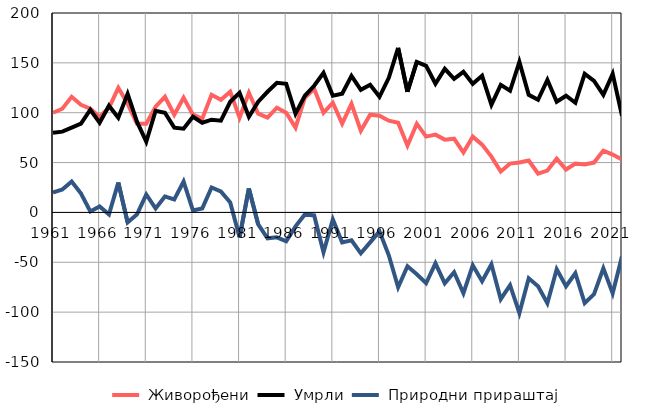
| Category |  Живорођени |  Умрли |  Природни прираштај |
|---|---|---|---|
| 1961.0 | 100 | 80 | 20 |
| 1962.0 | 104 | 81 | 23 |
| 1963.0 | 116 | 85 | 31 |
| 1964.0 | 108 | 89 | 19 |
| 1965.0 | 104 | 103 | 1 |
| 1966.0 | 96 | 90 | 6 |
| 1967.0 | 105 | 107 | -2 |
| 1968.0 | 125 | 95 | 30 |
| 1969.0 | 109 | 119 | -10 |
| 1970.0 | 89 | 91 | -2 |
| 1971.0 | 89 | 71 | 18 |
| 1972.0 | 106 | 102 | 4 |
| 1973.0 | 116 | 100 | 16 |
| 1974.0 | 98 | 85 | 13 |
| 1975.0 | 115 | 84 | 31 |
| 1976.0 | 98 | 96 | 2 |
| 1977.0 | 94 | 90 | 4 |
| 1978.0 | 118 | 93 | 25 |
| 1979.0 | 113 | 92 | 21 |
| 1980.0 | 121 | 111 | 10 |
| 1981.0 | 95 | 120 | -25 |
| 1982.0 | 120 | 96 | 24 |
| 1983.0 | 99 | 111 | -12 |
| 1984.0 | 95 | 121 | -26 |
| 1985.0 | 105 | 130 | -25 |
| 1986.0 | 100 | 129 | -29 |
| 1987.0 | 85 | 99 | -14 |
| 1988.0 | 115 | 117 | -2 |
| 1989.0 | 124 | 127 | -3 |
| 1990.0 | 100 | 140 | -40 |
| 1991.0 | 110 | 117 | -7 |
| 1992.0 | 89 | 119 | -30 |
| 1993.0 | 109 | 137 | -28 |
| 1994.0 | 82 | 123 | -41 |
| 1995.0 | 98 | 128 | -30 |
| 1996.0 | 97 | 116 | -19 |
| 1997.0 | 92 | 135 | -43 |
| 1998.0 | 90 | 165 | -75 |
| 1999.0 | 67 | 121 | -54 |
| 2000.0 | 89 | 151 | -62 |
| 2001.0 | 76 | 147 | -71 |
| 2002.0 | 78 | 129 | -51 |
| 2003.0 | 73 | 144 | -71 |
| 2004.0 | 74 | 134 | -60 |
| 2005.0 | 60 | 141 | -81 |
| 2006.0 | 76 | 129 | -53 |
| 2007.0 | 68 | 137 | -69 |
| 2008.0 | 56 | 108 | -52 |
| 2009.0 | 41 | 128 | -87 |
| 2010.0 | 49 | 122 | -73 |
| 2011.0 | 50 | 151 | -101 |
| 2012.0 | 52 | 118 | -66 |
| 2013.0 | 39 | 113 | -74 |
| 2014.0 | 42 | 133 | -91 |
| 2015.0 | 54 | 111 | -57 |
| 2016.0 | 43 | 117 | -74 |
| 2017.0 | 49 | 110 | -61 |
| 2018.0 | 48 | 139 | -91 |
| 2019.0 | 50 | 132 | -82 |
| 2020.0 | 62 | 118 | -56 |
| 2021.0 | 58 | 139 | -81 |
| 2022.0 | 53 | 97 | -44 |